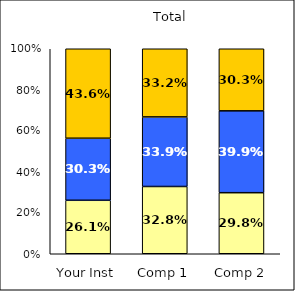
| Category | Low UG Ed Goal: Personal Development | Average UG Ed Goal: Personal Development | High UG Ed Goal: Personal Development |
|---|---|---|---|
| Your Inst | 0.261 | 0.303 | 0.436 |
| Comp 1 | 0.328 | 0.339 | 0.332 |
| Comp 2 | 0.298 | 0.399 | 0.303 |